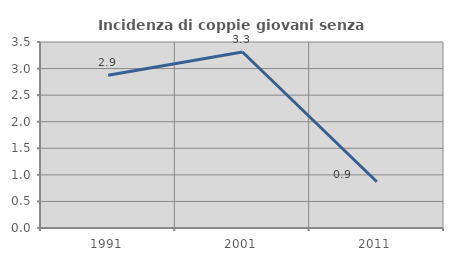
| Category | Incidenza di coppie giovani senza figli |
|---|---|
| 1991.0 | 2.874 |
| 2001.0 | 3.311 |
| 2011.0 | 0.87 |